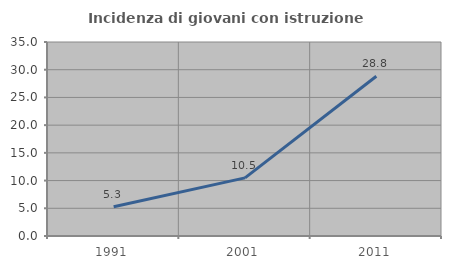
| Category | Incidenza di giovani con istruzione universitaria |
|---|---|
| 1991.0 | 5.263 |
| 2001.0 | 10.49 |
| 2011.0 | 28.829 |